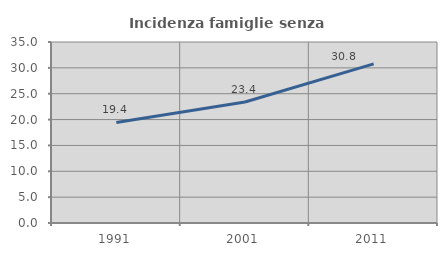
| Category | Incidenza famiglie senza nuclei |
|---|---|
| 1991.0 | 19.444 |
| 2001.0 | 23.396 |
| 2011.0 | 30.769 |